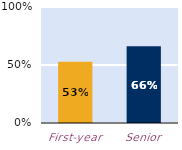
| Category | At least some |
|---|---|
| First-year | 0.528 |
| Senior | 0.662 |